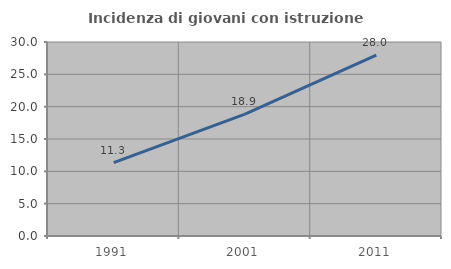
| Category | Incidenza di giovani con istruzione universitaria |
|---|---|
| 1991.0 | 11.339 |
| 2001.0 | 18.857 |
| 2011.0 | 27.97 |